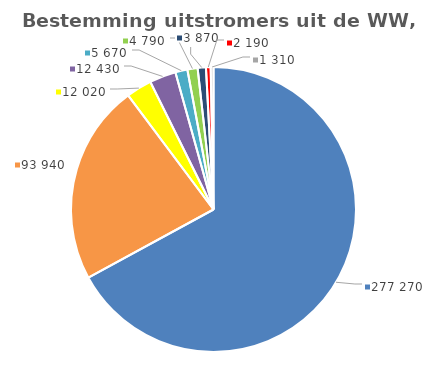
| Category | Series 0 |
|---|---|
| Niet gesubsidieerd werk | 277270 |
| Bijstand, WW of NUG | 93940 |
| Onbekend | 12020 |
| Andere uitkering of voorziening | 12430 |
| Bereiken AOW-leeftijd | 5670 |
| Volledig dagonderwijs | 4790 |
| Leerwerkbaan | 3870 |
| Stageplek | 2190 |
| Gesubsidieerd werk | 1310 |